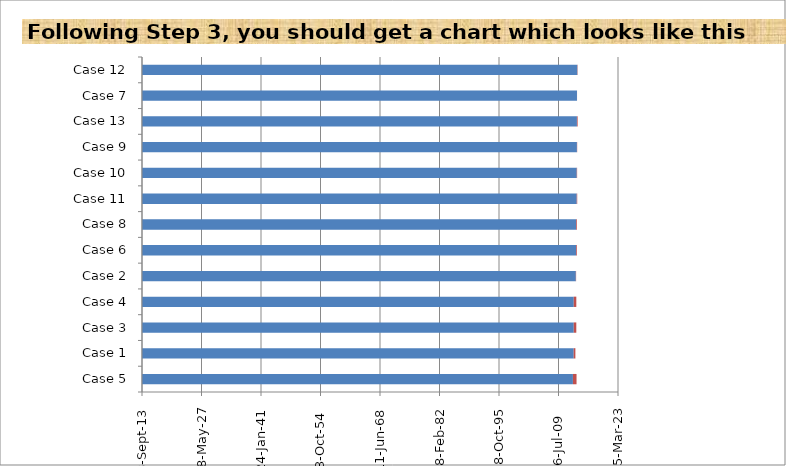
| Category | Date of Symptom Onset | Duration from Symptom Onset to Date of Diagnosis |
|---|---|---|
| Case 5 | 2012-10-30 | 304 |
| Case 1 | 2013-01-04 | 141 |
| Case 3 | 2013-01-09 | 213 |
| Case 4 | 2013-01-09 | 214 |
| Case 2 | 2013-07-01 | 23 |
| Case 6 | 2013-08-02 | 62 |
| Case 8 | 2013-08-06 | 61 |
| Case 11 | 2013-09-15 | 41 |
| Case 10 | 2013-09-17 | 30 |
| Case 9 | 2013-10-01 | 21 |
| Case 13 | 2013-10-02 | 59 |
| Case 7 | 2013-10-06 | 5 |
| Case 12 | 2013-11-04 | 25 |